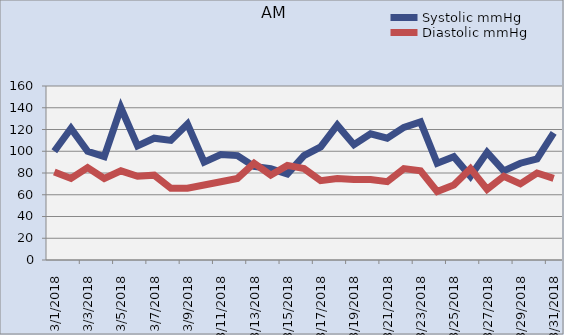
| Category | Systolic mmHg | Diastolic mmHg |
|---|---|---|
| 01/03/2018 | 100 | 81 |
| 02/03/2018 | 121 | 75 |
| 03/03/2018 | 100 | 85 |
| 04/03/2018 | 95 | 75 |
| 05/03/2018 | 140 | 82 |
| 06/03/2018 | 105 | 77 |
| 07/03/2018 | 112 | 78 |
| 08/03/2018 | 110 | 66 |
| 09/03/2018 | 125 | 66 |
| 10/03/2018 | 90 | 69 |
| 11/03/2018 | 97 | 72 |
| 12/03/2018 | 96 | 75 |
| 13/03/2018 | 86 | 89 |
| 14/03/2018 | 84 | 78 |
| 15/03/2018 | 79 | 87 |
| 16/03/2018 | 96 | 84 |
| 17/03/2018 | 104 | 73 |
| 18/03/2018 | 124 | 75 |
| 19/03/2018 | 106 | 74 |
| 20/03/2018 | 116 | 74 |
| 21/03/2018 | 112 | 72 |
| 22/03/2018 | 122 | 84 |
| 23/03/2018 | 127 | 82 |
| 24/03/2018 | 89 | 63 |
| 25/03/2018 | 95 | 69 |
| 26/03/2018 | 77 | 84 |
| 27/03/2018 | 99 | 65 |
| 28/03/2018 | 82 | 77 |
| 29/03/2018 | 89 | 70 |
| 30/03/2018 | 93 | 80 |
| 31/03/2018 | 117 | 75 |